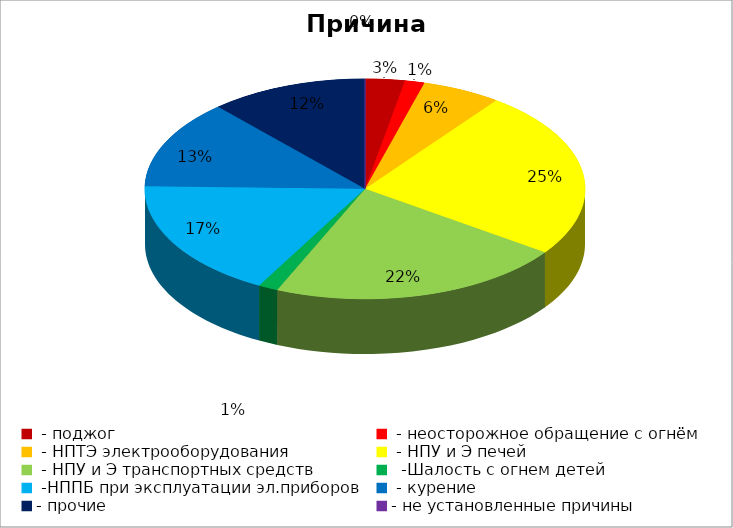
| Category | Причина пожара |
|---|---|
|  - поджог | 2 |
|  - неосторожное обращение с огнём | 1 |
|  - НПТЭ электрооборудования | 4 |
|  - НПУ и Э печей | 17 |
|  - НПУ и Э транспортных средств | 15 |
|   -Шалость с огнем детей | 1 |
|  -НППБ при эксплуатации эл.приборов | 12 |
|  - курение | 9 |
| - прочие | 8 |
| - не установленные причины | 0 |